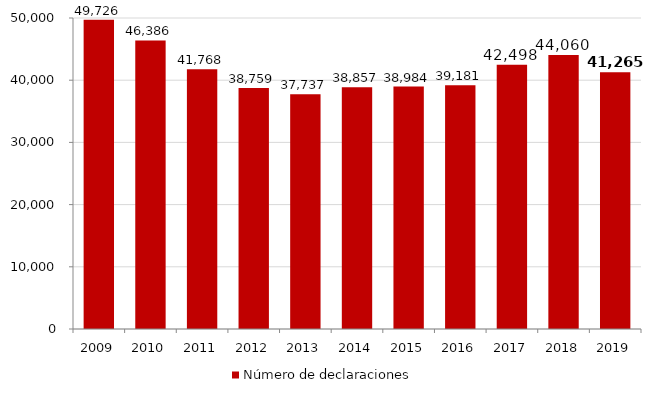
| Category | Número de declaraciones |
|---|---|
| 2009.0 | 49726 |
| 2010.0 | 46386 |
| 2011.0 | 41768 |
| 2012.0 | 38759 |
| 2013.0 | 37737 |
| 2014.0 | 38857 |
| 2015.0 | 38984 |
| 2016.0 | 39181 |
| 2017.0 | 42498 |
| 2018.0 | 44060 |
| 2019.0 | 41265 |